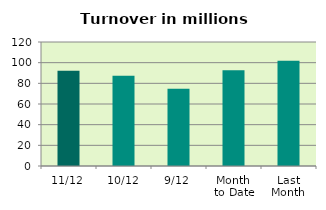
| Category | Series 0 |
|---|---|
| 11/12 | 92.181 |
| 10/12 | 87.378 |
| 9/12 | 74.876 |
| Month 
to Date | 92.66 |
| Last
Month | 101.866 |